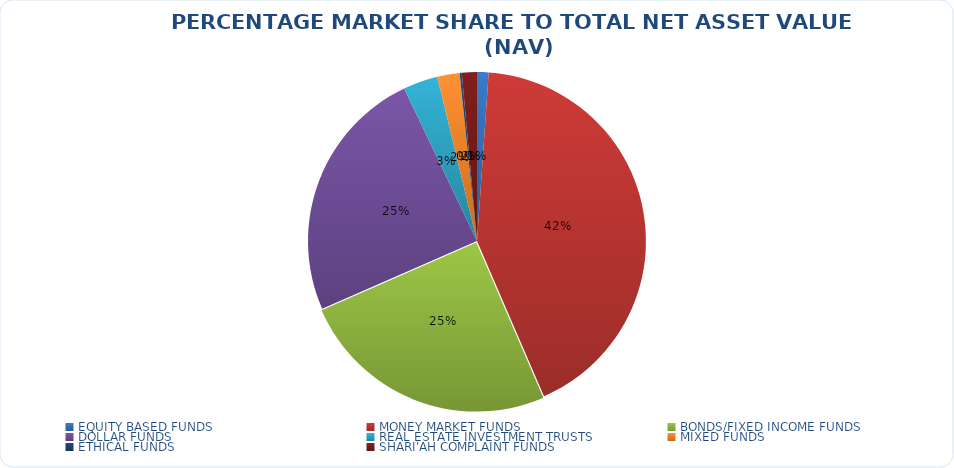
| Category | NET ASSET VALUE |
|---|---|
| EQUITY BASED FUNDS | 15213332672.29 |
| MONEY MARKET FUNDS | 584870498552.74 |
| BONDS/FIXED INCOME FUNDS | 343631563073.467 |
| DOLLAR FUNDS | 337593361628.049 |
| REAL ESTATE INVESTMENT TRUSTS | 45722431990.46 |
| MIXED FUNDS | 29384603401.98 |
| ETHICAL FUNDS | 2820100312.97 |
| SHARI'AH COMPLAINT FUNDS | 19844639157.2 |